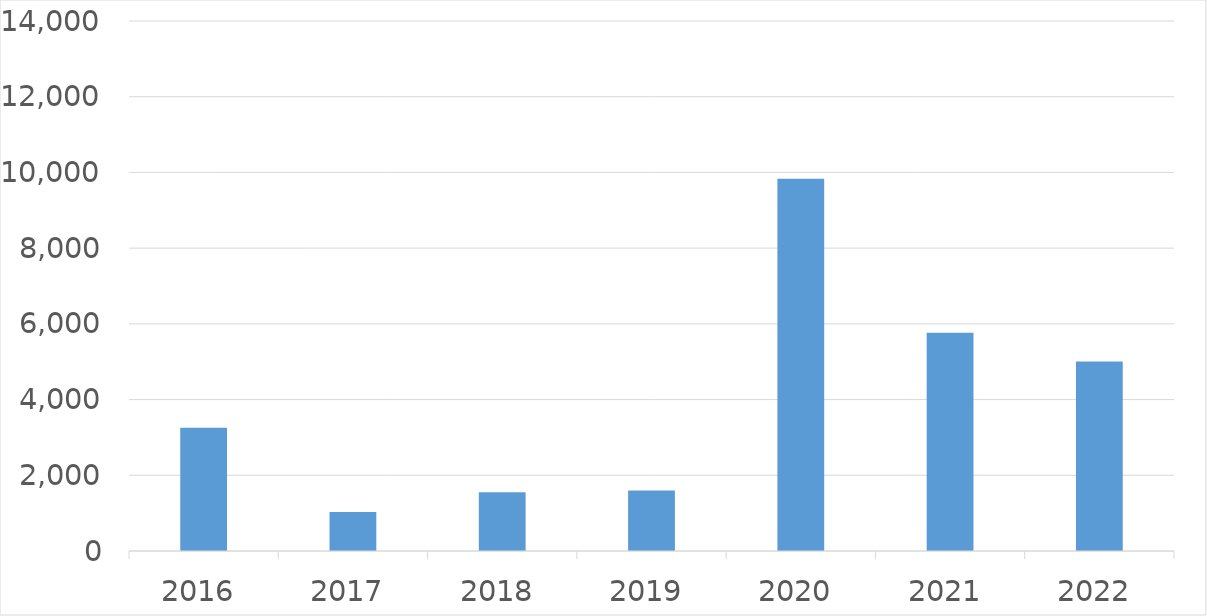
| Category | Series 0 |
|---|---|
| 2016 | 3257 |
| 2017 | 1029 |
| 2018 | 1552 |
| 2019 | 1600 |
| 2020 | 9835 |
| 2021 | 5767 |
| 2022 | 5003 |